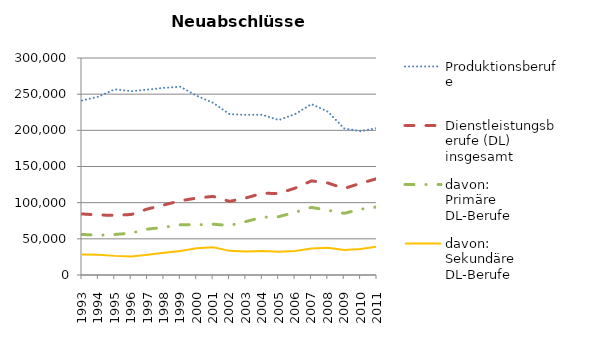
| Category | Produktionsberufe | Dienstleistungsberufe (DL) insgesamt | davon:
Primäre  DL-Berufe | davon: 
Sekundäre DL-Berufe |
|---|---|---|---|---|
| 1993.0 | 241230 | 84402 | 56109 | 28293 |
| 1994.0 | 246528 | 82977 | 54885 | 28092 |
| 1995.0 | 256734 | 82458 | 56022 | 26439 |
| 1996.0 | 254049 | 83631 | 57891 | 25740 |
| 1997.0 | 256287 | 91281 | 63417 | 27864 |
| 1998.0 | 258708 | 96831 | 65958 | 30873 |
| 1999.0 | 260253 | 102693 | 69438 | 33255 |
| 2000.0 | 247800 | 106338 | 69372 | 36966 |
| 2001.0 | 238008 | 108663 | 70221 | 38442 |
| 2002.0 | 222300 | 101796 | 68433 | 33366 |
| 2003.0 | 221457 | 106521 | 73866 | 32655 |
| 2004.0 | 221541 | 112968 | 79860 | 33105 |
| 2005.0 | 214209 | 112719 | 80583 | 32136 |
| 2006.0 | 222372 | 120039 | 86742 | 33297 |
| 2007.0 | 236220 | 130122 | 93486 | 36633 |
| 2008.0 | 225834 | 127269 | 89478 | 37791 |
| 2009.0 | 202584 | 119652 | 85230 | 34419 |
| 2010.0 | 198726 | 126756 | 90966 | 35787 |
| 2011.0 | 203061 | 133272 | 94134 | 39138 |